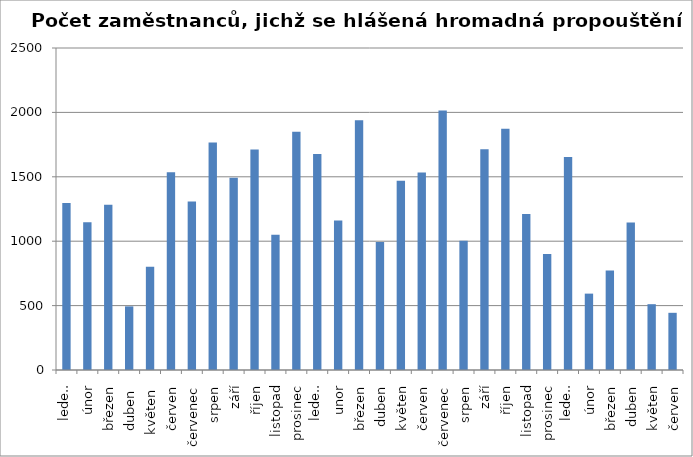
| Category | zaměstnanci |
|---|---|
| 0 | 1296 |
| 1 | 1148 |
| 2 | 1283 |
| 3 | 494 |
| 4 | 802 |
| 5 | 1535 |
| 6 | 1308 |
| 7 | 1767 |
| 8 | 1493 |
| 9 | 1712 |
| 10 | 1051 |
| 11 | 1849 |
| 12 | 1677 |
| 13 | 1160 |
| 14 | 1939 |
| 15 | 993 |
| 16 | 1470 |
| 17 | 1534 |
| 18 | 2014 |
| 19 | 1003 |
| 20 | 1713 |
| 21 | 1873 |
| 22 | 1212 |
| 23 | 901 |
| 24 | 1653 |
| 25 | 593 |
| 26 | 772 |
| 27 | 1146 |
| 28 | 511 |
| 29 | 444 |